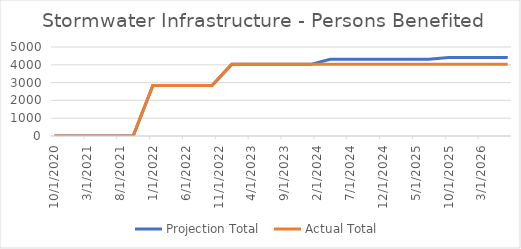
| Category | Projection Total  | Actual Total  |
|---|---|---|
| 10/1/20 | 0 | 0 |
| 1/1/21 | 0 | 0 |
| 4/1/21 | 0 | 0 |
| 7/1/21 | 0 | 0 |
| 10/1/21 | 0 | 0 |
| 1/1/22 | 2838 | 2838 |
| 4/1/22 | 2838 | 2838 |
| 7/1/22 | 2838 | 2838 |
| 10/1/22 | 2838 | 2838 |
| 1/1/23 | 4025 | 4025 |
| 4/1/23 | 4025 | 4025 |
| 7/1/23 | 4025 | 4025 |
| 10/1/23 | 4025 | 4025 |
| 1/1/24 | 4025 | 4025 |
| 4/1/24 | 4308 | 4025 |
| 7/1/24 | 4308 | 4025 |
| 10/1/24 | 4308 | 4025 |
| 1/1/25 | 4308 | 4025 |
| 4/1/25 | 4308 | 4025 |
| 7/1/25 | 4308 | 4025 |
| 10/1/25 | 4404 | 4025 |
| 1/1/26 | 4404 | 4025 |
| 4/1/26 | 4404 | 4025 |
| 7/1/26 | 4404 | 4025 |